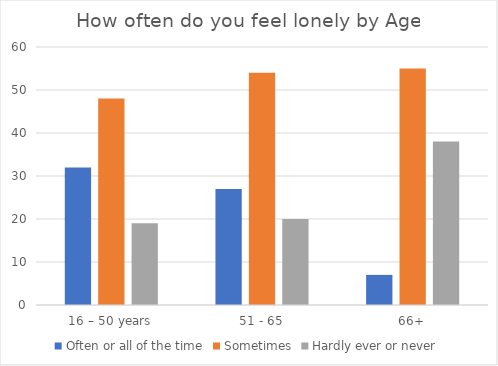
| Category | Often or all of the time | Sometimes | Hardly ever or never |
|---|---|---|---|
| 16 – 50 years | 32 | 48 | 19 |
| 51 - 65 | 27 | 54 | 20 |
| 66+ | 7 | 55 | 38 |